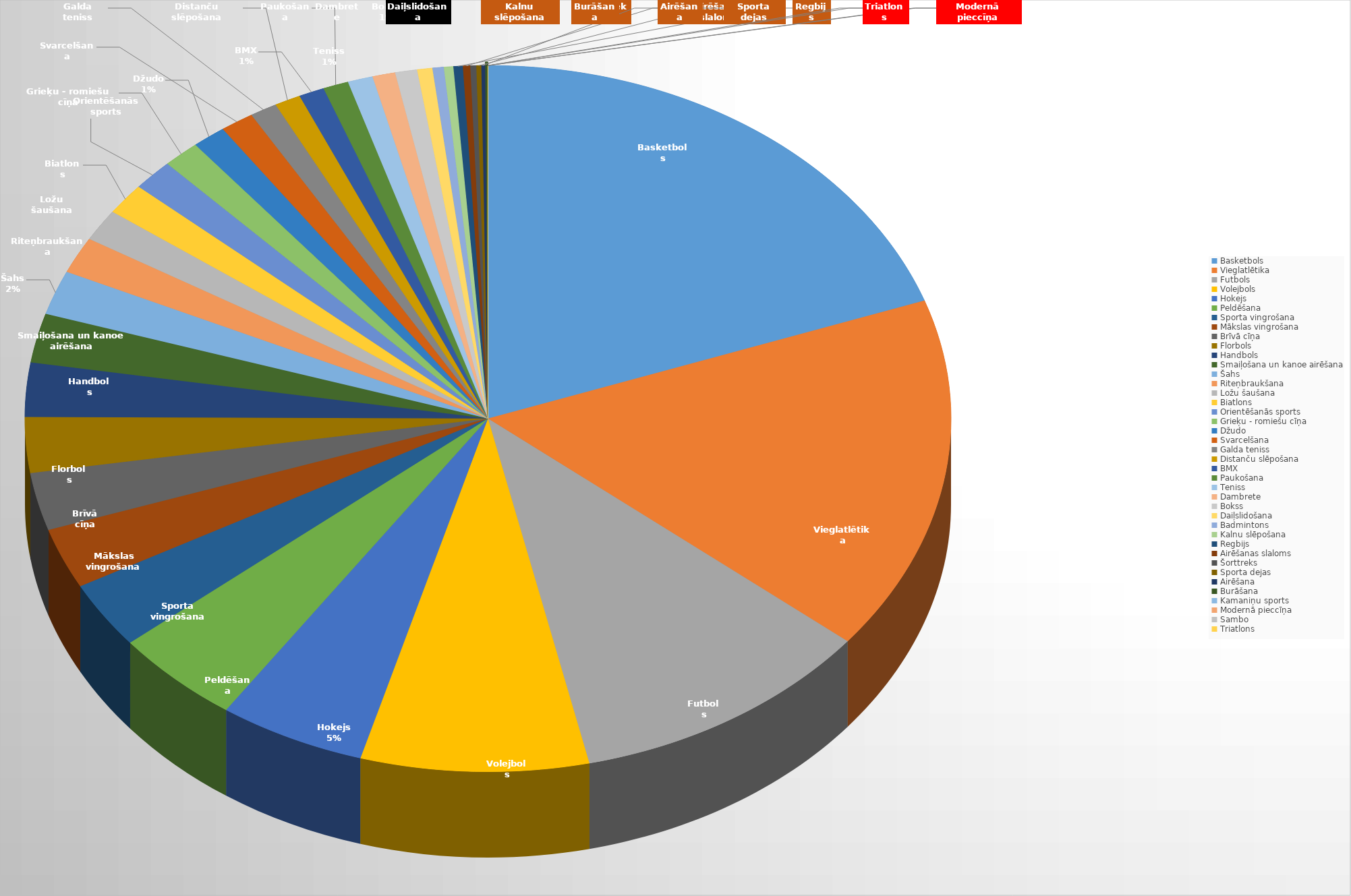
| Category | Series 0 |
|---|---|
| Basketbols | 19.573 |
| Vieglatlētika | 16.279 |
| Futbols | 10.635 |
| Volejbols | 7.951 |
| Hokejs | 5.122 |
| Peldēšana | 4.497 |
| Sporta vingrošana | 3.073 |
| Mākslas vingrošana | 2.762 |
| Brīvā cīņa | 2.637 |
| Florbols | 2.544 |
| Handbols | 2.474 |
| Smaiļošana un kanoe airēšana | 2.251 |
| Šahs | 2.021 |
| Riteņbraukšana | 1.674 |
| Ložu šaušana | 1.461 |
| Biatlons | 1.443 |
| Orientēšanās sports | 1.429 |
| Grieķu - romiešu cīņa | 1.292 |
| Džudo | 1.177 |
| Svarcelšana | 1.173 |
| Galda teniss | 0.949 |
| Distanču slēpošana | 0.913 |
| BMX | 0.89 |
| Paukošana | 0.889 |
| Teniss | 0.878 |
| Dambrete | 0.795 |
| Bokss | 0.768 |
| Daiļslidošana | 0.531 |
| Badmintons | 0.394 |
| Kalnu slēpošana | 0.331 |
| Regbijs | 0.326 |
| Airēšanas slaloms | 0.256 |
| Šorttreks | 0.208 |
| Sporta dejas | 0.171 |
| Airēšana | 0.135 |
| Burāšana | 0.095 |
| Kamaniņu sports | 0 |
| Modernā pieccīņa | 0 |
| Sambo | 0 |
| Triatlons | 0 |